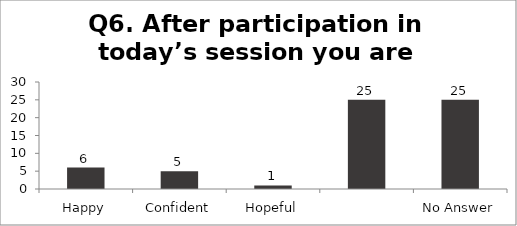
| Category | Q6. After participation in today’s session you are feeling? |
|---|---|
| Happy | 6 |
| Confident | 5 |
| Hopeful | 1 |
|  | 25 |
| No Answer | 25 |